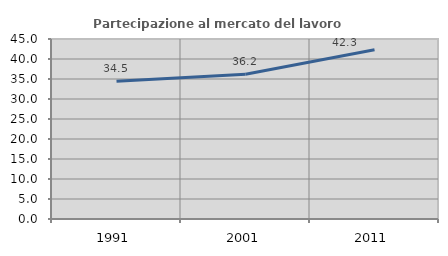
| Category | Partecipazione al mercato del lavoro  femminile |
|---|---|
| 1991.0 | 34.46 |
| 2001.0 | 36.212 |
| 2011.0 | 42.332 |